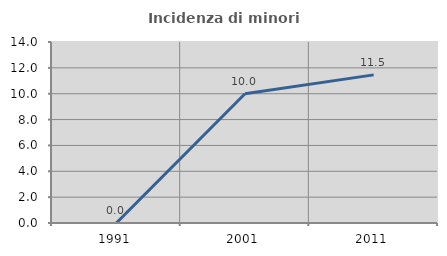
| Category | Incidenza di minori stranieri |
|---|---|
| 1991.0 | 0 |
| 2001.0 | 10 |
| 2011.0 | 11.458 |